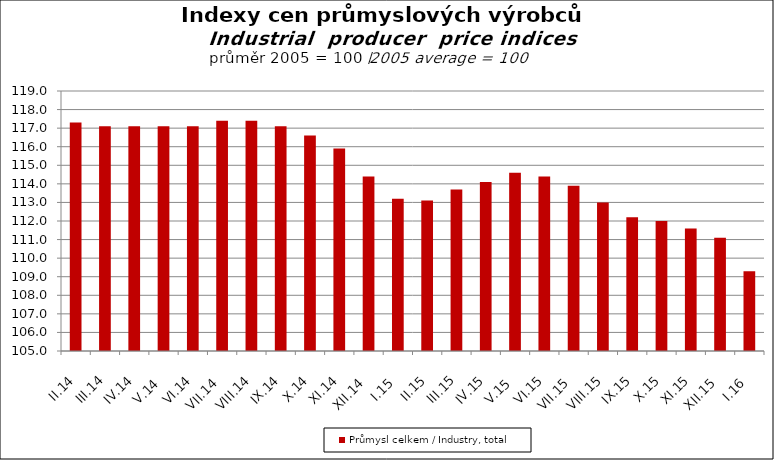
| Category | Průmysl celkem / Industry, total |
|---|---|
| II.14 | 117.3 |
| III.14 | 117.1 |
| IV.14 | 117.1 |
| V.14 | 117.1 |
| VI.14 | 117.1 |
| VII.14 | 117.4 |
| VIII.14 | 117.4 |
| IX.14 | 117.1 |
| X.14 | 116.6 |
| XI.14 | 115.9 |
| XII.14 | 114.4 |
| I.15 | 113.2 |
| II.15 | 113.1 |
| III.15 | 113.7 |
| IV.15 | 114.1 |
| V.15 | 114.6 |
| VI.15 | 114.4 |
| VII.15 | 113.9 |
| VIII.15 | 113 |
| IX.15 | 112.2 |
| X.15 | 112 |
| XI.15 | 111.6 |
| XII.15 | 111.1 |
| I.16 | 109.3 |